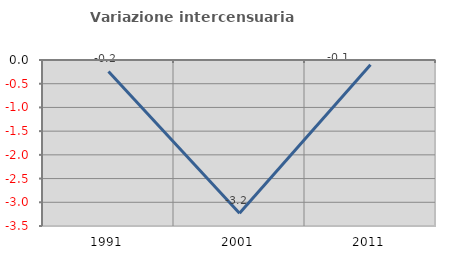
| Category | Variazione intercensuaria annua |
|---|---|
| 1991.0 | -0.241 |
| 2001.0 | -3.229 |
| 2011.0 | -0.101 |